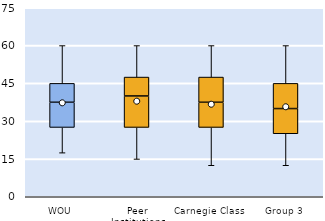
| Category | 25th | 50th | 75th |
|---|---|---|---|
| WOU | 27.5 | 10 | 7.5 |
| Peer Institutions | 27.5 | 12.5 | 7.5 |
| Carnegie Class | 27.5 | 10 | 10 |
| Group 3 | 25 | 10 | 10 |